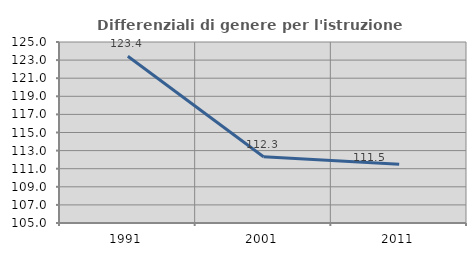
| Category | Differenziali di genere per l'istruzione superiore |
|---|---|
| 1991.0 | 123.418 |
| 2001.0 | 112.327 |
| 2011.0 | 111.498 |